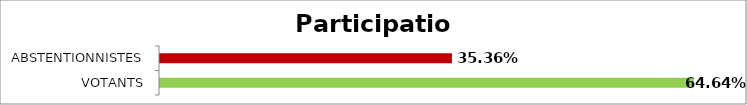
| Category | Participation |
|---|---|
| VOTANTS | 0.646 |
| ABSTENTIONNISTES | 0.354 |